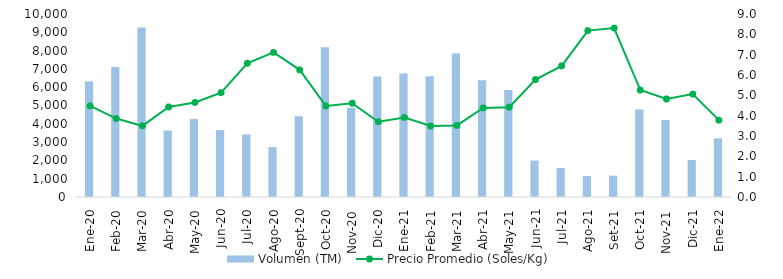
| Category | Volumen (TM)  |
|---|---|
| Ene-20 | 6317.272 |
| Feb-20 | 7108.594 |
| Mar-20 | 9265.69 |
| Abr-20 | 3634.823 |
| May-20 | 4263.477 |
| Jun-20 | 3651.591 |
| Jul-20 | 3418.994 |
| Ago-20 | 2726.894 |
| Sept-20 | 4411.041 |
| Oct-20 | 8183.975 |
| Nov-20 | 4875.586 |
| Dic-20 | 6586.764 |
| Ene-21 | 6751.697 |
| Feb-21 | 6592.927 |
| Mar-21 | 7841.248 |
| Abr-21 | 6375.734 |
| May-21 | 5841.315 |
| Jun-21 | 1990.807 |
| Jul-21 | 1580.297 |
| Ago-21 | 1145.354 |
| Set-21 | 1165.633 |
| Oct-21 | 4777.757 |
| Nov-21 | 4207.923 |
| Dic-21 | 2022.788 |
| Ene-22 | 3204.994 |